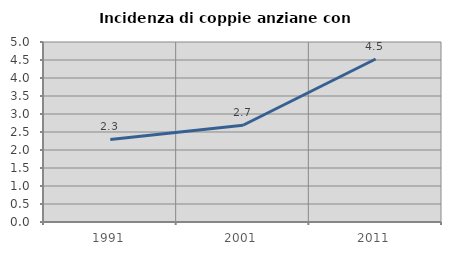
| Category | Incidenza di coppie anziane con figli |
|---|---|
| 1991.0 | 2.294 |
| 2001.0 | 2.687 |
| 2011.0 | 4.528 |